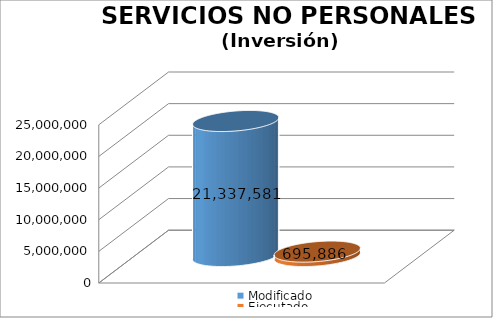
| Category | Modificado | Ejecutado |
|---|---|---|
| 0 | 21337581 | 695886.43 |